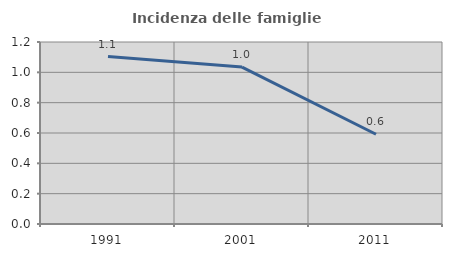
| Category | Incidenza delle famiglie numerose |
|---|---|
| 1991.0 | 1.104 |
| 2001.0 | 1.034 |
| 2011.0 | 0.592 |